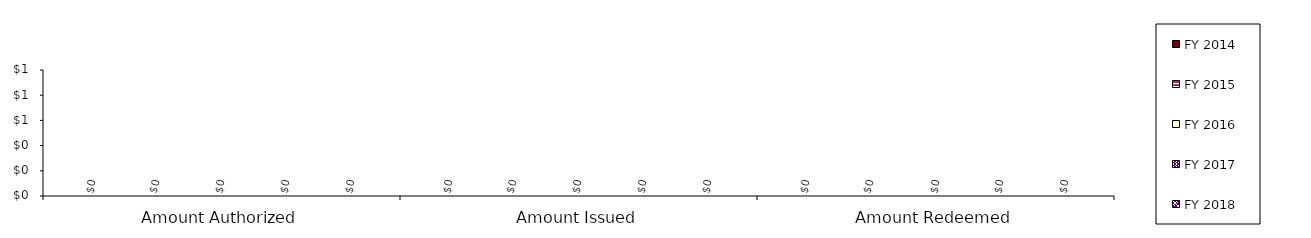
| Category | FY 2014 | FY 2015 | FY 2016 | FY 2017 | FY 2018 |
|---|---|---|---|---|---|
| Amount Authorized | 0 | 0 | 0 | 0 | 0 |
| Amount Issued | 0 | 0 | 0 | 0 | 0 |
| Amount Redeemed | 0 | 0 | 0 | 0 | 0 |